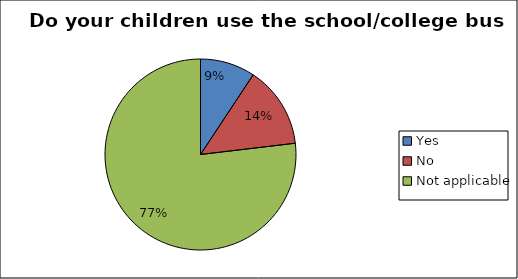
| Category | Series 0 |
|---|---|
| Yes | 0.093 |
| No | 0.138 |
| Not applicable | 0.769 |